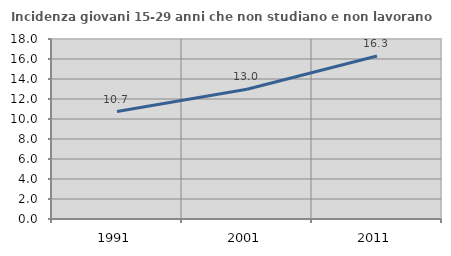
| Category | Incidenza giovani 15-29 anni che non studiano e non lavorano  |
|---|---|
| 1991.0 | 10.741 |
| 2001.0 | 12.973 |
| 2011.0 | 16.306 |